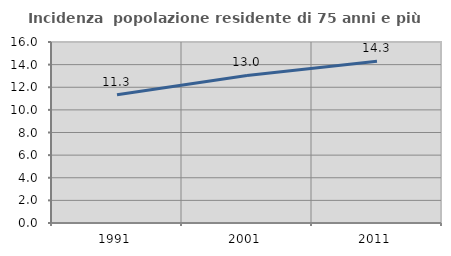
| Category | Incidenza  popolazione residente di 75 anni e più |
|---|---|
| 1991.0 | 11.342 |
| 2001.0 | 13.043 |
| 2011.0 | 14.306 |